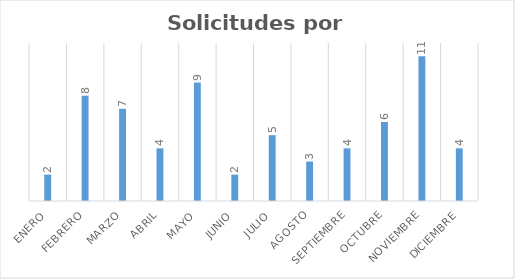
| Category | Series 0 |
|---|---|
| Enero | 2 |
| Febrero | 8 |
| Marzo | 7 |
| Abril | 4 |
| Mayo | 9 |
| Junio | 2 |
| Julio | 5 |
| Agosto | 3 |
| Septiembre | 4 |
| Octubre | 6 |
| Noviembre | 11 |
| Diciembre | 4 |